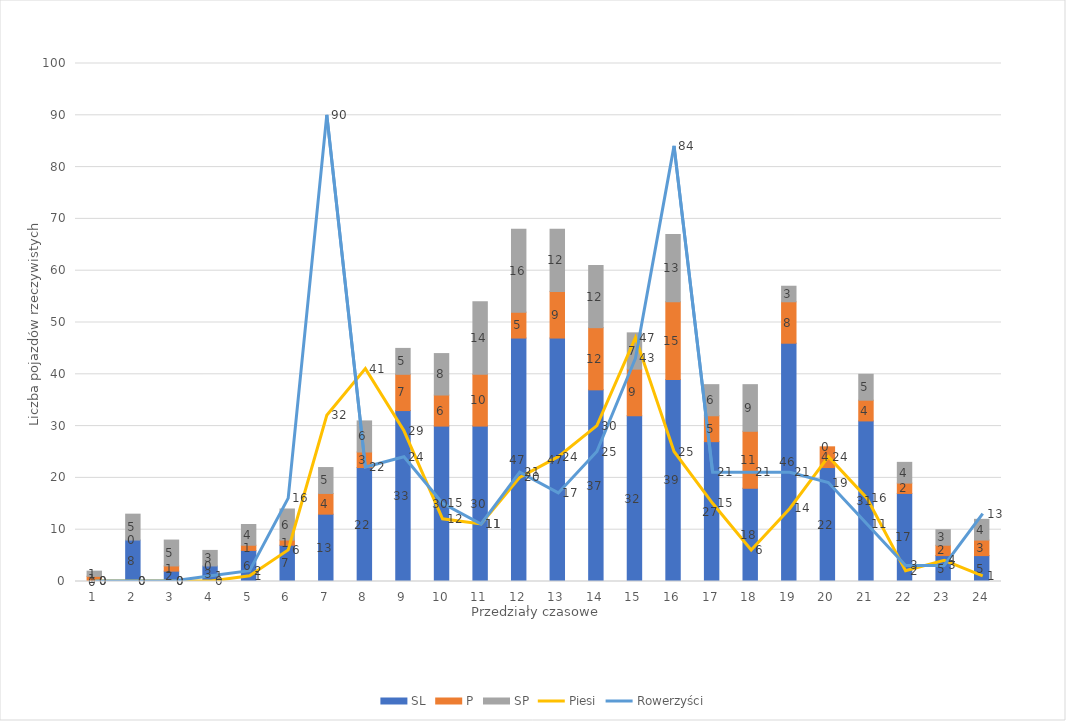
| Category | SL | P | SP |
|---|---|---|---|
| 0 | 0 | 1 | 1 |
| 1 | 8 | 0 | 5 |
| 2 | 2 | 1 | 5 |
| 3 | 3 | 0 | 3 |
| 4 | 6 | 1 | 4 |
| 5 | 7 | 1 | 6 |
| 6 | 13 | 4 | 5 |
| 7 | 22 | 3 | 6 |
| 8 | 33 | 7 | 5 |
| 9 | 30 | 6 | 8 |
| 10 | 30 | 10 | 14 |
| 11 | 47 | 5 | 16 |
| 12 | 47 | 9 | 12 |
| 13 | 37 | 12 | 12 |
| 14 | 32 | 9 | 7 |
| 15 | 39 | 15 | 13 |
| 16 | 27 | 5 | 6 |
| 17 | 18 | 11 | 9 |
| 18 | 46 | 8 | 3 |
| 19 | 22 | 4 | 0 |
| 20 | 31 | 4 | 5 |
| 21 | 17 | 2 | 4 |
| 22 | 5 | 2 | 3 |
| 23 | 5 | 3 | 4 |